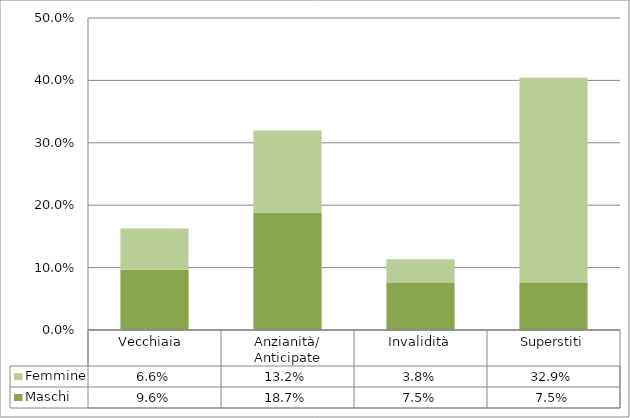
| Category | Maschi | Femmine |
|---|---|---|
| Vecchiaia  | 0.096 | 0.066 |
| Anzianità/ Anticipate | 0.187 | 0.132 |
| Invalidità | 0.075 | 0.038 |
| Superstiti | 0.075 | 0.329 |